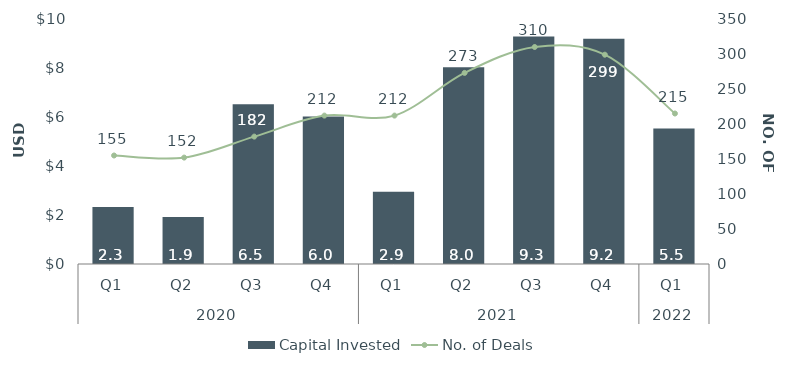
| Category | Capital Invested |
|---|---|
| 0 | 2.323 |
| 1 | 1.923 |
| 2 | 6.52 |
| 3 | 6.015 |
| 4 | 2.944 |
| 5 | 8.026 |
| 6 | 9.281 |
| 7 | 9.195 |
| 8 | 5.531 |